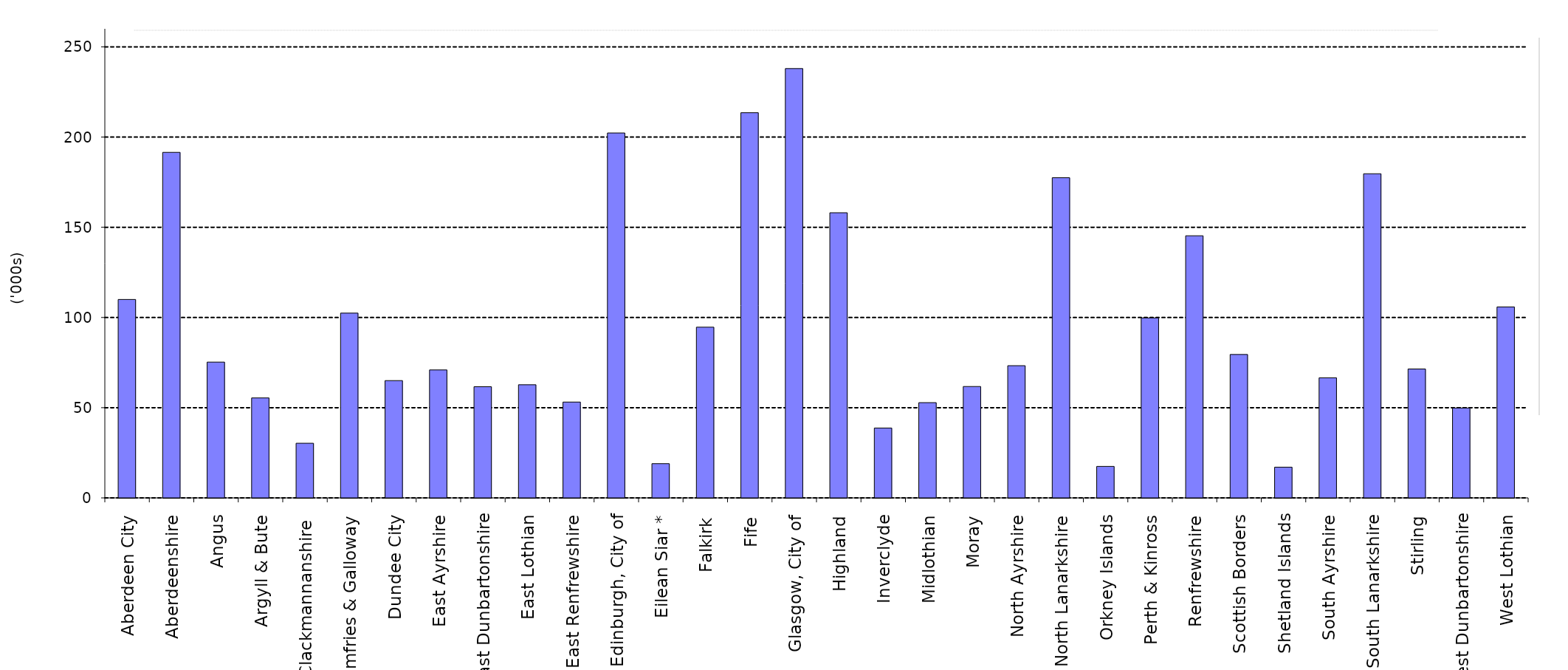
| Category | Series 0 |
|---|---|
| Aberdeen City | 109.983 |
| Aberdeenshire | 191.526 |
| Angus | 75.263 |
| Argyll & Bute | 55.405 |
| Clackmannanshire  | 30.277 |
| Dumfries & Galloway | 102.415 |
| Dundee City | 65.007 |
| East Ayrshire | 70.923 |
| East Dunbartonshire | 61.624 |
| East Lothian | 62.709 |
| East Renfrewshire | 53.119 |
| Edinburgh, City of | 202.259 |
| Eilean Siar * | 18.961 |
| Falkirk | 94.632 |
| Fife | 213.483 |
| Glasgow, City of | 237.961 |
| Highland | 158.044 |
| Inverclyde | 38.723 |
| Midlothian | 52.791 |
| Moray | 61.733 |
| North Ayrshire | 73.275 |
| North Lanarkshire | 177.459 |
| Orkney Islands | 17.451 |
| Perth & Kinross | 99.757 |
| Renfrewshire | 145.286 |
| Scottish Borders | 79.489 |
| Shetland Islands | 17.025 |
| South Ayrshire | 66.559 |
| South Lanarkshire | 179.659 |
| Stirling | 71.443 |
| West Dunbartonshire | 49.825 |
| West Lothian | 105.814 |